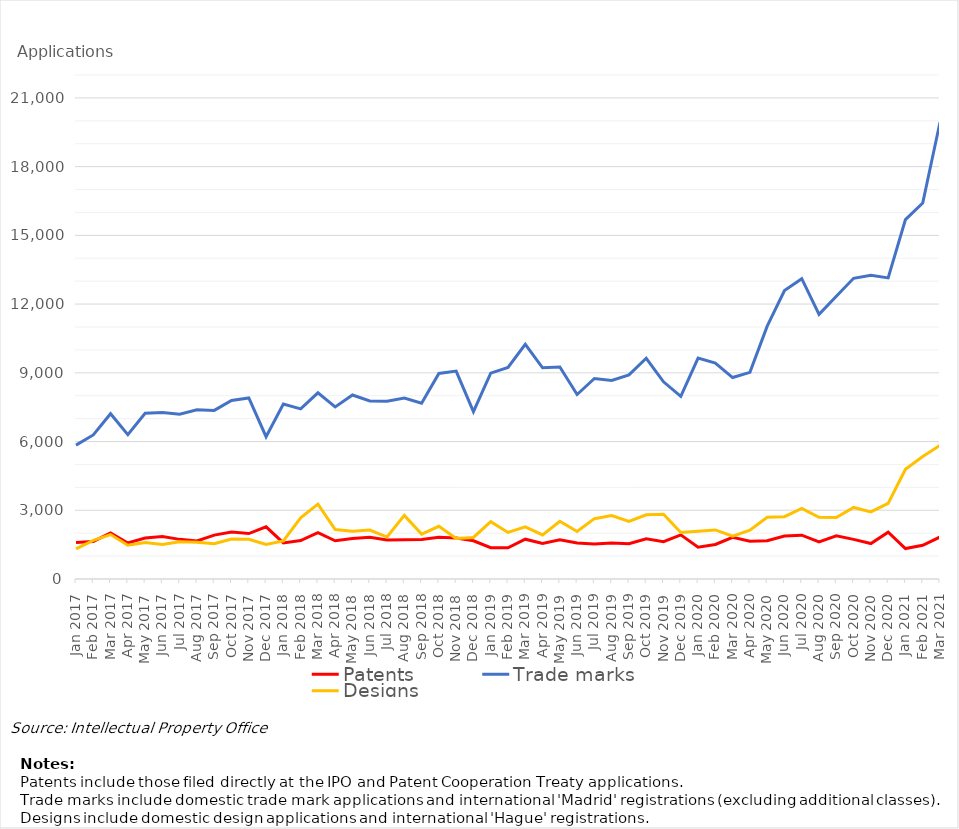
| Category | Patents | Trade marks | Designs |
|---|---|---|---|
| Jan 2017 | 1596 | 5843 | 1318 |
| Feb 2017 | 1640 | 6288 | 1687 |
| Mar 2017 | 2011 | 7214 | 1940 |
| Apr 2017 | 1573 | 6297 | 1474 |
| May 2017 | 1790 | 7234 | 1592 |
| Jun 2017 | 1853 | 7263 | 1502 |
| Jul 2017 | 1730 | 7197 | 1627 |
| Aug 2017 | 1657 | 7389 | 1600 |
| Sep 2017 | 1915 | 7359 | 1544 |
| Oct 2017 | 2055 | 7792 | 1745 |
| Nov 2017 | 1983 | 7901 | 1736 |
| Dec 2017 | 2277 | 6211 | 1507 |
| Jan 2018 | 1575 | 7634 | 1658 |
| Feb 2018 | 1676 | 7428 | 2672 |
| Mar 2018 | 2022 | 8127 | 3267 |
| Apr 2018 | 1670 | 7512 | 2160 |
| May 2018 | 1767 | 8030 | 2083 |
| Jun 2018 | 1821 | 7769 | 2136 |
| Jul 2018 | 1704 | 7757 | 1832 |
| Aug 2018 | 1713 | 7897 | 2777 |
| Sep 2018 | 1725 | 7673 | 1960 |
| Oct 2018 | 1818 | 8972 | 2302 |
| Nov 2018 | 1787 | 9076 | 1765 |
| Dec 2018 | 1670 | 7304 | 1815 |
| Jan 2019 | 1367 | 8984 | 2505 |
| Feb 2019 | 1361 | 9234 | 2031 |
| Mar 2019 | 1737 | 10243 | 2274 |
| Apr 2019 | 1552 | 9219 | 1923 |
| May 2019 | 1710 | 9251 | 2520 |
| Jun 2019 | 1569 | 8053 | 2074 |
| Jul 2019 | 1527 | 8752 | 2634 |
| Aug 2019 | 1571 | 8670 | 2768 |
| Sep 2019 | 1540 | 8907 | 2511 |
| Oct 2019 | 1755 | 9636 | 2800 |
| Nov 2019 | 1630 | 8607 | 2827 |
| Dec 2019 | 1926 | 7970 | 2028 |
| Jan 2020 | 1392 | 9642 | 2082 |
| Feb 2020 | 1506 | 9428 | 2143 |
| Mar 2020 | 1819 | 8794 | 1871 |
| Apr 2020 | 1648 | 9021 | 2127 |
| May 2020 | 1671 | 11035 | 2694 |
| Jun 2020 | 1880 | 12593 | 2721 |
| Jul 2020 | 1911 | 13110 | 3085 |
| Aug 2020 | 1616 | 11551 | 2694 |
| Sep 2020 | 1886 | 12340 | 2686 |
| Oct 2020 | 1731 | 13126 | 3124 |
| Nov 2020 | 1548 | 13254 | 2930 |
| Dec 2020 | 2043 | 13143 | 3303 |
| Jan 2021 | 1330 | 15686 | 4792 |
| Feb 2021 | 1472 | 16412 | 5347 |
| Mar 2021 | 1831 | 19936 | 5836 |